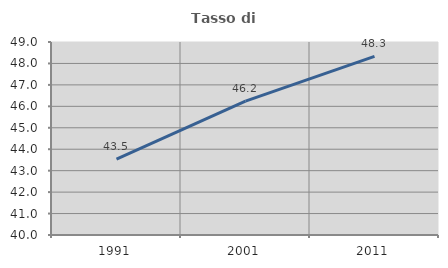
| Category | Tasso di occupazione   |
|---|---|
| 1991.0 | 43.534 |
| 2001.0 | 46.244 |
| 2011.0 | 48.326 |